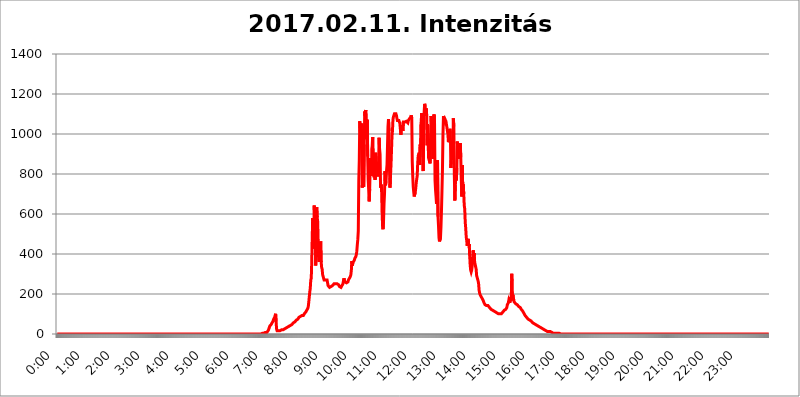
| Category | 2017.02.11. Intenzitás [W/m^2] |
|---|---|
| 0.0 | 0 |
| 0.0006944444444444445 | 0 |
| 0.001388888888888889 | 0 |
| 0.0020833333333333333 | 0 |
| 0.002777777777777778 | 0 |
| 0.003472222222222222 | 0 |
| 0.004166666666666667 | 0 |
| 0.004861111111111111 | 0 |
| 0.005555555555555556 | 0 |
| 0.0062499999999999995 | 0 |
| 0.006944444444444444 | 0 |
| 0.007638888888888889 | 0 |
| 0.008333333333333333 | 0 |
| 0.009027777777777779 | 0 |
| 0.009722222222222222 | 0 |
| 0.010416666666666666 | 0 |
| 0.011111111111111112 | 0 |
| 0.011805555555555555 | 0 |
| 0.012499999999999999 | 0 |
| 0.013194444444444444 | 0 |
| 0.013888888888888888 | 0 |
| 0.014583333333333332 | 0 |
| 0.015277777777777777 | 0 |
| 0.015972222222222224 | 0 |
| 0.016666666666666666 | 0 |
| 0.017361111111111112 | 0 |
| 0.018055555555555557 | 0 |
| 0.01875 | 0 |
| 0.019444444444444445 | 0 |
| 0.02013888888888889 | 0 |
| 0.020833333333333332 | 0 |
| 0.02152777777777778 | 0 |
| 0.022222222222222223 | 0 |
| 0.02291666666666667 | 0 |
| 0.02361111111111111 | 0 |
| 0.024305555555555556 | 0 |
| 0.024999999999999998 | 0 |
| 0.025694444444444447 | 0 |
| 0.02638888888888889 | 0 |
| 0.027083333333333334 | 0 |
| 0.027777777777777776 | 0 |
| 0.02847222222222222 | 0 |
| 0.029166666666666664 | 0 |
| 0.029861111111111113 | 0 |
| 0.030555555555555555 | 0 |
| 0.03125 | 0 |
| 0.03194444444444445 | 0 |
| 0.03263888888888889 | 0 |
| 0.03333333333333333 | 0 |
| 0.034027777777777775 | 0 |
| 0.034722222222222224 | 0 |
| 0.035416666666666666 | 0 |
| 0.036111111111111115 | 0 |
| 0.03680555555555556 | 0 |
| 0.0375 | 0 |
| 0.03819444444444444 | 0 |
| 0.03888888888888889 | 0 |
| 0.03958333333333333 | 0 |
| 0.04027777777777778 | 0 |
| 0.04097222222222222 | 0 |
| 0.041666666666666664 | 0 |
| 0.042361111111111106 | 0 |
| 0.04305555555555556 | 0 |
| 0.043750000000000004 | 0 |
| 0.044444444444444446 | 0 |
| 0.04513888888888889 | 0 |
| 0.04583333333333334 | 0 |
| 0.04652777777777778 | 0 |
| 0.04722222222222222 | 0 |
| 0.04791666666666666 | 0 |
| 0.04861111111111111 | 0 |
| 0.049305555555555554 | 0 |
| 0.049999999999999996 | 0 |
| 0.05069444444444445 | 0 |
| 0.051388888888888894 | 0 |
| 0.052083333333333336 | 0 |
| 0.05277777777777778 | 0 |
| 0.05347222222222222 | 0 |
| 0.05416666666666667 | 0 |
| 0.05486111111111111 | 0 |
| 0.05555555555555555 | 0 |
| 0.05625 | 0 |
| 0.05694444444444444 | 0 |
| 0.057638888888888885 | 0 |
| 0.05833333333333333 | 0 |
| 0.05902777777777778 | 0 |
| 0.059722222222222225 | 0 |
| 0.06041666666666667 | 0 |
| 0.061111111111111116 | 0 |
| 0.06180555555555556 | 0 |
| 0.0625 | 0 |
| 0.06319444444444444 | 0 |
| 0.06388888888888888 | 0 |
| 0.06458333333333334 | 0 |
| 0.06527777777777778 | 0 |
| 0.06597222222222222 | 0 |
| 0.06666666666666667 | 0 |
| 0.06736111111111111 | 0 |
| 0.06805555555555555 | 0 |
| 0.06874999999999999 | 0 |
| 0.06944444444444443 | 0 |
| 0.07013888888888889 | 0 |
| 0.07083333333333333 | 0 |
| 0.07152777777777779 | 0 |
| 0.07222222222222223 | 0 |
| 0.07291666666666667 | 0 |
| 0.07361111111111111 | 0 |
| 0.07430555555555556 | 0 |
| 0.075 | 0 |
| 0.07569444444444444 | 0 |
| 0.0763888888888889 | 0 |
| 0.07708333333333334 | 0 |
| 0.07777777777777778 | 0 |
| 0.07847222222222222 | 0 |
| 0.07916666666666666 | 0 |
| 0.0798611111111111 | 0 |
| 0.08055555555555556 | 0 |
| 0.08125 | 0 |
| 0.08194444444444444 | 0 |
| 0.08263888888888889 | 0 |
| 0.08333333333333333 | 0 |
| 0.08402777777777777 | 0 |
| 0.08472222222222221 | 0 |
| 0.08541666666666665 | 0 |
| 0.08611111111111112 | 0 |
| 0.08680555555555557 | 0 |
| 0.08750000000000001 | 0 |
| 0.08819444444444445 | 0 |
| 0.08888888888888889 | 0 |
| 0.08958333333333333 | 0 |
| 0.09027777777777778 | 0 |
| 0.09097222222222222 | 0 |
| 0.09166666666666667 | 0 |
| 0.09236111111111112 | 0 |
| 0.09305555555555556 | 0 |
| 0.09375 | 0 |
| 0.09444444444444444 | 0 |
| 0.09513888888888888 | 0 |
| 0.09583333333333333 | 0 |
| 0.09652777777777777 | 0 |
| 0.09722222222222222 | 0 |
| 0.09791666666666667 | 0 |
| 0.09861111111111111 | 0 |
| 0.09930555555555555 | 0 |
| 0.09999999999999999 | 0 |
| 0.10069444444444443 | 0 |
| 0.1013888888888889 | 0 |
| 0.10208333333333335 | 0 |
| 0.10277777777777779 | 0 |
| 0.10347222222222223 | 0 |
| 0.10416666666666667 | 0 |
| 0.10486111111111111 | 0 |
| 0.10555555555555556 | 0 |
| 0.10625 | 0 |
| 0.10694444444444444 | 0 |
| 0.1076388888888889 | 0 |
| 0.10833333333333334 | 0 |
| 0.10902777777777778 | 0 |
| 0.10972222222222222 | 0 |
| 0.1111111111111111 | 0 |
| 0.11180555555555556 | 0 |
| 0.11180555555555556 | 0 |
| 0.1125 | 0 |
| 0.11319444444444444 | 0 |
| 0.11388888888888889 | 0 |
| 0.11458333333333333 | 0 |
| 0.11527777777777777 | 0 |
| 0.11597222222222221 | 0 |
| 0.11666666666666665 | 0 |
| 0.1173611111111111 | 0 |
| 0.11805555555555557 | 0 |
| 0.11944444444444445 | 0 |
| 0.12013888888888889 | 0 |
| 0.12083333333333333 | 0 |
| 0.12152777777777778 | 0 |
| 0.12222222222222223 | 0 |
| 0.12291666666666667 | 0 |
| 0.12291666666666667 | 0 |
| 0.12361111111111112 | 0 |
| 0.12430555555555556 | 0 |
| 0.125 | 0 |
| 0.12569444444444444 | 0 |
| 0.12638888888888888 | 0 |
| 0.12708333333333333 | 0 |
| 0.16875 | 0 |
| 0.12847222222222224 | 0 |
| 0.12916666666666668 | 0 |
| 0.12986111111111112 | 0 |
| 0.13055555555555556 | 0 |
| 0.13125 | 0 |
| 0.13194444444444445 | 0 |
| 0.1326388888888889 | 0 |
| 0.13333333333333333 | 0 |
| 0.13402777777777777 | 0 |
| 0.13402777777777777 | 0 |
| 0.13472222222222222 | 0 |
| 0.13541666666666666 | 0 |
| 0.1361111111111111 | 0 |
| 0.13749999999999998 | 0 |
| 0.13819444444444443 | 0 |
| 0.1388888888888889 | 0 |
| 0.13958333333333334 | 0 |
| 0.14027777777777778 | 0 |
| 0.14097222222222222 | 0 |
| 0.14166666666666666 | 0 |
| 0.1423611111111111 | 0 |
| 0.14305555555555557 | 0 |
| 0.14375000000000002 | 0 |
| 0.14444444444444446 | 0 |
| 0.1451388888888889 | 0 |
| 0.1451388888888889 | 0 |
| 0.14652777777777778 | 0 |
| 0.14722222222222223 | 0 |
| 0.14791666666666667 | 0 |
| 0.1486111111111111 | 0 |
| 0.14930555555555555 | 0 |
| 0.15 | 0 |
| 0.15069444444444444 | 0 |
| 0.15138888888888888 | 0 |
| 0.15208333333333332 | 0 |
| 0.15277777777777776 | 0 |
| 0.15347222222222223 | 0 |
| 0.15416666666666667 | 0 |
| 0.15486111111111112 | 0 |
| 0.15555555555555556 | 0 |
| 0.15625 | 0 |
| 0.15694444444444444 | 0 |
| 0.15763888888888888 | 0 |
| 0.15833333333333333 | 0 |
| 0.15902777777777777 | 0 |
| 0.15972222222222224 | 0 |
| 0.16041666666666668 | 0 |
| 0.16111111111111112 | 0 |
| 0.16180555555555556 | 0 |
| 0.1625 | 0 |
| 0.16319444444444445 | 0 |
| 0.1638888888888889 | 0 |
| 0.16458333333333333 | 0 |
| 0.16527777777777777 | 0 |
| 0.16597222222222222 | 0 |
| 0.16666666666666666 | 0 |
| 0.1673611111111111 | 0 |
| 0.16805555555555554 | 0 |
| 0.16874999999999998 | 0 |
| 0.16944444444444443 | 0 |
| 0.17013888888888887 | 0 |
| 0.1708333333333333 | 0 |
| 0.17152777777777775 | 0 |
| 0.17222222222222225 | 0 |
| 0.1729166666666667 | 0 |
| 0.17361111111111113 | 0 |
| 0.17430555555555557 | 0 |
| 0.17500000000000002 | 0 |
| 0.17569444444444446 | 0 |
| 0.1763888888888889 | 0 |
| 0.17708333333333334 | 0 |
| 0.17777777777777778 | 0 |
| 0.17847222222222223 | 0 |
| 0.17916666666666667 | 0 |
| 0.1798611111111111 | 0 |
| 0.18055555555555555 | 0 |
| 0.18125 | 0 |
| 0.18194444444444444 | 0 |
| 0.1826388888888889 | 0 |
| 0.18333333333333335 | 0 |
| 0.1840277777777778 | 0 |
| 0.18472222222222223 | 0 |
| 0.18541666666666667 | 0 |
| 0.18611111111111112 | 0 |
| 0.18680555555555556 | 0 |
| 0.1875 | 0 |
| 0.18819444444444444 | 0 |
| 0.18888888888888888 | 0 |
| 0.18958333333333333 | 0 |
| 0.19027777777777777 | 0 |
| 0.1909722222222222 | 0 |
| 0.19166666666666665 | 0 |
| 0.19236111111111112 | 0 |
| 0.19305555555555554 | 0 |
| 0.19375 | 0 |
| 0.19444444444444445 | 0 |
| 0.1951388888888889 | 0 |
| 0.19583333333333333 | 0 |
| 0.19652777777777777 | 0 |
| 0.19722222222222222 | 0 |
| 0.19791666666666666 | 0 |
| 0.1986111111111111 | 0 |
| 0.19930555555555554 | 0 |
| 0.19999999999999998 | 0 |
| 0.20069444444444443 | 0 |
| 0.20138888888888887 | 0 |
| 0.2020833333333333 | 0 |
| 0.2027777777777778 | 0 |
| 0.2034722222222222 | 0 |
| 0.2041666666666667 | 0 |
| 0.20486111111111113 | 0 |
| 0.20555555555555557 | 0 |
| 0.20625000000000002 | 0 |
| 0.20694444444444446 | 0 |
| 0.2076388888888889 | 0 |
| 0.20833333333333334 | 0 |
| 0.20902777777777778 | 0 |
| 0.20972222222222223 | 0 |
| 0.21041666666666667 | 0 |
| 0.2111111111111111 | 0 |
| 0.21180555555555555 | 0 |
| 0.2125 | 0 |
| 0.21319444444444444 | 0 |
| 0.2138888888888889 | 0 |
| 0.21458333333333335 | 0 |
| 0.2152777777777778 | 0 |
| 0.21597222222222223 | 0 |
| 0.21666666666666667 | 0 |
| 0.21736111111111112 | 0 |
| 0.21805555555555556 | 0 |
| 0.21875 | 0 |
| 0.21944444444444444 | 0 |
| 0.22013888888888888 | 0 |
| 0.22083333333333333 | 0 |
| 0.22152777777777777 | 0 |
| 0.2222222222222222 | 0 |
| 0.22291666666666665 | 0 |
| 0.2236111111111111 | 0 |
| 0.22430555555555556 | 0 |
| 0.225 | 0 |
| 0.22569444444444445 | 0 |
| 0.2263888888888889 | 0 |
| 0.22708333333333333 | 0 |
| 0.22777777777777777 | 0 |
| 0.22847222222222222 | 0 |
| 0.22916666666666666 | 0 |
| 0.2298611111111111 | 0 |
| 0.23055555555555554 | 0 |
| 0.23124999999999998 | 0 |
| 0.23194444444444443 | 0 |
| 0.23263888888888887 | 0 |
| 0.2333333333333333 | 0 |
| 0.2340277777777778 | 0 |
| 0.2347222222222222 | 0 |
| 0.2354166666666667 | 0 |
| 0.23611111111111113 | 0 |
| 0.23680555555555557 | 0 |
| 0.23750000000000002 | 0 |
| 0.23819444444444446 | 0 |
| 0.2388888888888889 | 0 |
| 0.23958333333333334 | 0 |
| 0.24027777777777778 | 0 |
| 0.24097222222222223 | 0 |
| 0.24166666666666667 | 0 |
| 0.2423611111111111 | 0 |
| 0.24305555555555555 | 0 |
| 0.24375 | 0 |
| 0.24444444444444446 | 0 |
| 0.24513888888888888 | 0 |
| 0.24583333333333335 | 0 |
| 0.2465277777777778 | 0 |
| 0.24722222222222223 | 0 |
| 0.24791666666666667 | 0 |
| 0.24861111111111112 | 0 |
| 0.24930555555555556 | 0 |
| 0.25 | 0 |
| 0.25069444444444444 | 0 |
| 0.2513888888888889 | 0 |
| 0.2520833333333333 | 0 |
| 0.25277777777777777 | 0 |
| 0.2534722222222222 | 0 |
| 0.25416666666666665 | 0 |
| 0.2548611111111111 | 0 |
| 0.2555555555555556 | 0 |
| 0.25625000000000003 | 0 |
| 0.2569444444444445 | 0 |
| 0.2576388888888889 | 0 |
| 0.25833333333333336 | 0 |
| 0.2590277777777778 | 0 |
| 0.25972222222222224 | 0 |
| 0.2604166666666667 | 0 |
| 0.2611111111111111 | 0 |
| 0.26180555555555557 | 0 |
| 0.2625 | 0 |
| 0.26319444444444445 | 0 |
| 0.2638888888888889 | 0 |
| 0.26458333333333334 | 0 |
| 0.2652777777777778 | 0 |
| 0.2659722222222222 | 0 |
| 0.26666666666666666 | 0 |
| 0.2673611111111111 | 0 |
| 0.26805555555555555 | 0 |
| 0.26875 | 0 |
| 0.26944444444444443 | 0 |
| 0.2701388888888889 | 0 |
| 0.2708333333333333 | 0 |
| 0.27152777777777776 | 0 |
| 0.2722222222222222 | 0 |
| 0.27291666666666664 | 0 |
| 0.2736111111111111 | 0 |
| 0.2743055555555555 | 0 |
| 0.27499999999999997 | 0 |
| 0.27569444444444446 | 0 |
| 0.27638888888888885 | 0 |
| 0.27708333333333335 | 0 |
| 0.2777777777777778 | 0 |
| 0.27847222222222223 | 0 |
| 0.2791666666666667 | 0 |
| 0.2798611111111111 | 0 |
| 0.28055555555555556 | 0 |
| 0.28125 | 0 |
| 0.28194444444444444 | 0 |
| 0.2826388888888889 | 0 |
| 0.2833333333333333 | 0 |
| 0.28402777777777777 | 0 |
| 0.2847222222222222 | 0 |
| 0.28541666666666665 | 0 |
| 0.28611111111111115 | 3.525 |
| 0.28680555555555554 | 3.525 |
| 0.28750000000000003 | 3.525 |
| 0.2881944444444445 | 3.525 |
| 0.2888888888888889 | 3.525 |
| 0.28958333333333336 | 3.525 |
| 0.2902777777777778 | 3.525 |
| 0.29097222222222224 | 3.525 |
| 0.2916666666666667 | 7.887 |
| 0.2923611111111111 | 7.887 |
| 0.29305555555555557 | 7.887 |
| 0.29375 | 7.887 |
| 0.29444444444444445 | 12.257 |
| 0.2951388888888889 | 12.257 |
| 0.29583333333333334 | 16.636 |
| 0.2965277777777778 | 21.024 |
| 0.2972222222222222 | 29.823 |
| 0.29791666666666666 | 38.653 |
| 0.2986111111111111 | 38.653 |
| 0.29930555555555555 | 43.079 |
| 0.3 | 47.511 |
| 0.30069444444444443 | 51.951 |
| 0.3013888888888889 | 56.398 |
| 0.3020833333333333 | 60.85 |
| 0.30277777777777776 | 65.31 |
| 0.3034722222222222 | 74.246 |
| 0.30416666666666664 | 78.722 |
| 0.3048611111111111 | 83.205 |
| 0.3055555555555555 | 92.184 |
| 0.30624999999999997 | 101.184 |
| 0.3069444444444444 | 60.85 |
| 0.3076388888888889 | 25.419 |
| 0.30833333333333335 | 16.636 |
| 0.3090277777777778 | 16.636 |
| 0.30972222222222223 | 16.636 |
| 0.3104166666666667 | 16.636 |
| 0.3111111111111111 | 16.636 |
| 0.31180555555555556 | 16.636 |
| 0.3125 | 16.636 |
| 0.31319444444444444 | 21.024 |
| 0.3138888888888889 | 21.024 |
| 0.3145833333333333 | 21.024 |
| 0.31527777777777777 | 21.024 |
| 0.3159722222222222 | 21.024 |
| 0.31666666666666665 | 21.024 |
| 0.31736111111111115 | 25.419 |
| 0.31805555555555554 | 25.419 |
| 0.31875000000000003 | 25.419 |
| 0.3194444444444445 | 29.823 |
| 0.3201388888888889 | 29.823 |
| 0.32083333333333336 | 29.823 |
| 0.3215277777777778 | 34.234 |
| 0.32222222222222224 | 34.234 |
| 0.3229166666666667 | 34.234 |
| 0.3236111111111111 | 34.234 |
| 0.32430555555555557 | 38.653 |
| 0.325 | 38.653 |
| 0.32569444444444445 | 38.653 |
| 0.3263888888888889 | 38.653 |
| 0.32708333333333334 | 43.079 |
| 0.3277777777777778 | 43.079 |
| 0.3284722222222222 | 47.511 |
| 0.32916666666666666 | 47.511 |
| 0.3298611111111111 | 47.511 |
| 0.33055555555555555 | 51.951 |
| 0.33125 | 56.398 |
| 0.33194444444444443 | 56.398 |
| 0.3326388888888889 | 60.85 |
| 0.3333333333333333 | 60.85 |
| 0.3340277777777778 | 65.31 |
| 0.3347222222222222 | 65.31 |
| 0.3354166666666667 | 69.775 |
| 0.3361111111111111 | 69.775 |
| 0.3368055555555556 | 74.246 |
| 0.33749999999999997 | 74.246 |
| 0.33819444444444446 | 78.722 |
| 0.33888888888888885 | 83.205 |
| 0.33958333333333335 | 83.205 |
| 0.34027777777777773 | 87.692 |
| 0.34097222222222223 | 87.692 |
| 0.3416666666666666 | 92.184 |
| 0.3423611111111111 | 92.184 |
| 0.3430555555555555 | 92.184 |
| 0.34375 | 92.184 |
| 0.3444444444444445 | 92.184 |
| 0.3451388888888889 | 92.184 |
| 0.3458333333333334 | 96.682 |
| 0.34652777777777777 | 101.184 |
| 0.34722222222222227 | 105.69 |
| 0.34791666666666665 | 105.69 |
| 0.34861111111111115 | 110.201 |
| 0.34930555555555554 | 114.716 |
| 0.35000000000000003 | 119.235 |
| 0.3506944444444444 | 123.758 |
| 0.3513888888888889 | 128.284 |
| 0.3520833333333333 | 137.347 |
| 0.3527777777777778 | 160.056 |
| 0.3534722222222222 | 164.605 |
| 0.3541666666666667 | 210.182 |
| 0.3548611111111111 | 228.436 |
| 0.35555555555555557 | 269.49 |
| 0.35625 | 278.603 |
| 0.35694444444444445 | 360.221 |
| 0.3576388888888889 | 489.108 |
| 0.35833333333333334 | 579.542 |
| 0.3590277777777778 | 427.39 |
| 0.3597222222222222 | 453.968 |
| 0.36041666666666666 | 642.4 |
| 0.3611111111111111 | 571.049 |
| 0.36180555555555555 | 545.416 |
| 0.3625 | 342.162 |
| 0.36319444444444443 | 519.555 |
| 0.3638888888888889 | 634.105 |
| 0.3645833333333333 | 583.779 |
| 0.3652777777777778 | 562.53 |
| 0.3659722222222222 | 462.786 |
| 0.3666666666666667 | 373.729 |
| 0.3673611111111111 | 360.221 |
| 0.3680555555555556 | 431.833 |
| 0.36874999999999997 | 418.492 |
| 0.36944444444444446 | 462.786 |
| 0.37013888888888885 | 360.221 |
| 0.37083333333333335 | 333.113 |
| 0.37152777777777773 | 324.052 |
| 0.37222222222222223 | 296.808 |
| 0.3729166666666666 | 287.709 |
| 0.3736111111111111 | 278.603 |
| 0.3743055555555555 | 269.49 |
| 0.375 | 269.49 |
| 0.3756944444444445 | 269.49 |
| 0.3763888888888889 | 269.49 |
| 0.3770833333333334 | 274.047 |
| 0.37777777777777777 | 274.047 |
| 0.37847222222222227 | 269.49 |
| 0.37916666666666665 | 255.813 |
| 0.37986111111111115 | 242.127 |
| 0.38055555555555554 | 237.564 |
| 0.38125000000000003 | 237.564 |
| 0.3819444444444444 | 233 |
| 0.3826388888888889 | 233 |
| 0.3833333333333333 | 233 |
| 0.3840277777777778 | 237.564 |
| 0.3847222222222222 | 237.564 |
| 0.3854166666666667 | 242.127 |
| 0.3861111111111111 | 242.127 |
| 0.38680555555555557 | 246.689 |
| 0.3875 | 246.689 |
| 0.38819444444444445 | 251.251 |
| 0.3888888888888889 | 251.251 |
| 0.38958333333333334 | 251.251 |
| 0.3902777777777778 | 251.251 |
| 0.3909722222222222 | 251.251 |
| 0.39166666666666666 | 251.251 |
| 0.3923611111111111 | 251.251 |
| 0.39305555555555555 | 251.251 |
| 0.39375 | 246.689 |
| 0.39444444444444443 | 246.689 |
| 0.3951388888888889 | 242.127 |
| 0.3958333333333333 | 237.564 |
| 0.3965277777777778 | 233 |
| 0.3972222222222222 | 233 |
| 0.3979166666666667 | 233 |
| 0.3986111111111111 | 237.564 |
| 0.3993055555555556 | 242.127 |
| 0.39999999999999997 | 246.689 |
| 0.40069444444444446 | 251.251 |
| 0.40138888888888885 | 255.813 |
| 0.40208333333333335 | 278.603 |
| 0.40277777777777773 | 269.49 |
| 0.40347222222222223 | 260.373 |
| 0.4041666666666666 | 255.813 |
| 0.4048611111111111 | 255.813 |
| 0.4055555555555555 | 255.813 |
| 0.40625 | 255.813 |
| 0.4069444444444445 | 260.373 |
| 0.4076388888888889 | 260.373 |
| 0.4083333333333334 | 269.49 |
| 0.40902777777777777 | 274.047 |
| 0.40972222222222227 | 278.603 |
| 0.41041666666666665 | 283.156 |
| 0.41111111111111115 | 287.709 |
| 0.41180555555555554 | 296.808 |
| 0.41250000000000003 | 319.517 |
| 0.4131944444444444 | 364.728 |
| 0.4138888888888889 | 342.162 |
| 0.4145833333333333 | 355.712 |
| 0.4152777777777778 | 351.198 |
| 0.4159722222222222 | 360.221 |
| 0.4166666666666667 | 369.23 |
| 0.4173611111111111 | 378.224 |
| 0.41805555555555557 | 382.715 |
| 0.41875 | 387.202 |
| 0.41944444444444445 | 396.164 |
| 0.4201388888888889 | 414.035 |
| 0.42083333333333334 | 445.129 |
| 0.4215277777777778 | 471.582 |
| 0.4222222222222222 | 515.223 |
| 0.42291666666666666 | 767.62 |
| 0.4236111111111111 | 868.305 |
| 0.42430555555555555 | 1063.51 |
| 0.425 | 1014.852 |
| 0.42569444444444443 | 996.182 |
| 0.4263888888888889 | 1052.255 |
| 0.4270833333333333 | 928.819 |
| 0.4277777777777778 | 731.896 |
| 0.4284722222222222 | 779.42 |
| 0.4291666666666667 | 747.834 |
| 0.4298611111111111 | 735.89 |
| 0.4305555555555556 | 947.58 |
| 0.43124999999999997 | 1112.618 |
| 0.43194444444444446 | 1089.873 |
| 0.43263888888888885 | 1120.238 |
| 0.43333333333333335 | 1063.51 |
| 0.43402777777777773 | 973.772 |
| 0.43472222222222223 | 1071.027 |
| 0.4354166666666666 | 887.309 |
| 0.4361111111111111 | 771.559 |
| 0.4368055555555555 | 719.877 |
| 0.4375 | 663.019 |
| 0.4381944444444445 | 723.889 |
| 0.4388888888888889 | 837.682 |
| 0.4395833333333334 | 879.719 |
| 0.44027777777777777 | 806.757 |
| 0.44097222222222227 | 791.169 |
| 0.44166666666666665 | 936.33 |
| 0.44236111111111115 | 984.98 |
| 0.44305555555555554 | 860.676 |
| 0.44375000000000003 | 833.834 |
| 0.4444444444444444 | 783.342 |
| 0.4451388888888889 | 902.447 |
| 0.4458333333333333 | 771.559 |
| 0.4465277777777778 | 906.223 |
| 0.4472222222222222 | 872.114 |
| 0.4479166666666667 | 853.029 |
| 0.4486111111111111 | 833.834 |
| 0.44930555555555557 | 818.392 |
| 0.45 | 787.258 |
| 0.45069444444444445 | 837.682 |
| 0.4513888888888889 | 981.244 |
| 0.45208333333333334 | 925.06 |
| 0.4527777777777778 | 898.668 |
| 0.4534722222222222 | 731.896 |
| 0.45416666666666666 | 747.834 |
| 0.4548611111111111 | 723.889 |
| 0.45555555555555555 | 617.436 |
| 0.45625 | 541.121 |
| 0.45694444444444443 | 523.88 |
| 0.4576388888888889 | 566.793 |
| 0.4583333333333333 | 650.667 |
| 0.4590277777777778 | 703.762 |
| 0.4597222222222222 | 814.519 |
| 0.4604166666666667 | 743.859 |
| 0.4611111111111111 | 763.674 |
| 0.4618055555555556 | 814.519 |
| 0.46249999999999997 | 845.365 |
| 0.46319444444444446 | 940.082 |
| 0.46388888888888885 | 1037.277 |
| 0.46458333333333335 | 1074.789 |
| 0.46527777777777773 | 1014.852 |
| 0.46597222222222223 | 822.26 |
| 0.4666666666666666 | 731.896 |
| 0.4673611111111111 | 791.169 |
| 0.4680555555555555 | 841.526 |
| 0.46875 | 845.365 |
| 0.4694444444444445 | 984.98 |
| 0.4701388888888889 | 1014.852 |
| 0.4708333333333334 | 1071.027 |
| 0.47152777777777777 | 1086.097 |
| 0.47222222222222227 | 1086.097 |
| 0.47291666666666665 | 1101.226 |
| 0.47361111111111115 | 1097.437 |
| 0.47430555555555554 | 1101.226 |
| 0.47500000000000003 | 1101.226 |
| 0.4756944444444444 | 1093.653 |
| 0.4763888888888889 | 1078.555 |
| 0.4770833333333333 | 1067.267 |
| 0.4777777777777778 | 1063.51 |
| 0.4784722222222222 | 1063.51 |
| 0.4791666666666667 | 1067.267 |
| 0.4798611111111111 | 1063.51 |
| 0.48055555555555557 | 1052.255 |
| 0.48125 | 1052.255 |
| 0.48194444444444445 | 996.182 |
| 0.4826388888888889 | 1044.762 |
| 0.48333333333333334 | 1044.762 |
| 0.4840277777777778 | 1048.508 |
| 0.4847222222222222 | 1014.852 |
| 0.48541666666666666 | 1059.756 |
| 0.4861111111111111 | 1059.756 |
| 0.48680555555555555 | 1059.756 |
| 0.4875 | 1059.756 |
| 0.48819444444444443 | 1063.51 |
| 0.4888888888888889 | 1063.51 |
| 0.4895833333333333 | 1063.51 |
| 0.4902777777777778 | 1063.51 |
| 0.4909722222222222 | 1063.51 |
| 0.4916666666666667 | 1056.004 |
| 0.4923611111111111 | 1067.267 |
| 0.4930555555555556 | 1071.027 |
| 0.49374999999999997 | 1074.789 |
| 0.49444444444444446 | 1078.555 |
| 0.49513888888888885 | 1078.555 |
| 0.49583333333333335 | 1086.097 |
| 0.49652777777777773 | 1093.653 |
| 0.49722222222222223 | 1078.555 |
| 0.4979166666666666 | 860.676 |
| 0.4986111111111111 | 787.258 |
| 0.4993055555555555 | 735.89 |
| 0.5 | 707.8 |
| 0.5006944444444444 | 687.544 |
| 0.5013888888888889 | 691.608 |
| 0.5020833333333333 | 707.8 |
| 0.5027777777777778 | 727.896 |
| 0.5034722222222222 | 755.766 |
| 0.5041666666666667 | 759.723 |
| 0.5048611111111111 | 791.169 |
| 0.5055555555555555 | 853.029 |
| 0.50625 | 891.099 |
| 0.5069444444444444 | 894.885 |
| 0.5076388888888889 | 906.223 |
| 0.5083333333333333 | 845.365 |
| 0.5090277777777777 | 947.58 |
| 0.5097222222222222 | 925.06 |
| 0.5104166666666666 | 1059.756 |
| 0.5111111111111112 | 1105.019 |
| 0.5118055555555555 | 1033.537 |
| 0.5125000000000001 | 906.223 |
| 0.5131944444444444 | 814.519 |
| 0.513888888888889 | 977.508 |
| 0.5145833333333333 | 1108.816 |
| 0.5152777777777778 | 1150.946 |
| 0.5159722222222222 | 1139.384 |
| 0.5166666666666667 | 1089.873 |
| 0.517361111111111 | 1127.879 |
| 0.5180555555555556 | 1105.019 |
| 0.5187499999999999 | 943.832 |
| 0.5194444444444445 | 1048.508 |
| 0.5201388888888888 | 962.555 |
| 0.5208333333333334 | 879.719 |
| 0.5215277777777778 | 879.719 |
| 0.5222222222222223 | 883.516 |
| 0.5229166666666667 | 853.029 |
| 0.5236111111111111 | 977.508 |
| 0.5243055555555556 | 1089.873 |
| 0.525 | 1044.762 |
| 0.5256944444444445 | 1007.383 |
| 0.5263888888888889 | 984.98 |
| 0.5270833333333333 | 875.918 |
| 0.5277777777777778 | 875.918 |
| 0.5284722222222222 | 1097.437 |
| 0.5291666666666667 | 1052.255 |
| 0.5298611111111111 | 767.62 |
| 0.5305555555555556 | 719.877 |
| 0.53125 | 687.544 |
| 0.5319444444444444 | 650.667 |
| 0.5326388888888889 | 703.762 |
| 0.5333333333333333 | 868.305 |
| 0.5340277777777778 | 588.009 |
| 0.5347222222222222 | 541.121 |
| 0.5354166666666667 | 480.356 |
| 0.5361111111111111 | 462.786 |
| 0.5368055555555555 | 462.786 |
| 0.5375 | 480.356 |
| 0.5381944444444444 | 536.82 |
| 0.5388888888888889 | 617.436 |
| 0.5395833333333333 | 715.858 |
| 0.5402777777777777 | 822.26 |
| 0.5409722222222222 | 992.448 |
| 0.5416666666666666 | 1089.873 |
| 0.5423611111111112 | 1078.555 |
| 0.5430555555555555 | 1067.267 |
| 0.5437500000000001 | 1074.789 |
| 0.5444444444444444 | 1074.789 |
| 0.545138888888889 | 1063.51 |
| 0.5458333333333333 | 1059.756 |
| 0.5465277777777778 | 1033.537 |
| 0.5472222222222222 | 1014.852 |
| 0.5479166666666667 | 999.916 |
| 0.548611111111111 | 958.814 |
| 0.5493055555555556 | 970.034 |
| 0.5499999999999999 | 1007.383 |
| 0.5506944444444445 | 1026.06 |
| 0.5513888888888888 | 1003.65 |
| 0.5520833333333334 | 829.981 |
| 0.5527777777777778 | 868.305 |
| 0.5534722222222223 | 947.58 |
| 0.5541666666666667 | 925.06 |
| 0.5548611111111111 | 947.58 |
| 0.5555555555555556 | 1078.555 |
| 0.55625 | 1037.277 |
| 0.5569444444444445 | 791.169 |
| 0.5576388888888889 | 667.123 |
| 0.5583333333333333 | 747.834 |
| 0.5590277777777778 | 779.42 |
| 0.5597222222222222 | 767.62 |
| 0.5604166666666667 | 829.981 |
| 0.5611111111111111 | 962.555 |
| 0.5618055555555556 | 875.918 |
| 0.5625 | 955.071 |
| 0.5631944444444444 | 875.918 |
| 0.5638888888888889 | 872.114 |
| 0.5645833333333333 | 925.06 |
| 0.5652777777777778 | 955.071 |
| 0.5659722222222222 | 883.516 |
| 0.5666666666666667 | 771.559 |
| 0.5673611111111111 | 687.544 |
| 0.5680555555555555 | 845.365 |
| 0.56875 | 727.896 |
| 0.5694444444444444 | 747.834 |
| 0.5701388888888889 | 699.717 |
| 0.5708333333333333 | 642.4 |
| 0.5715277777777777 | 625.784 |
| 0.5722222222222222 | 558.261 |
| 0.5729166666666666 | 528.2 |
| 0.5736111111111112 | 484.735 |
| 0.5743055555555555 | 467.187 |
| 0.5750000000000001 | 440.702 |
| 0.5756944444444444 | 462.786 |
| 0.576388888888889 | 475.972 |
| 0.5770833333333333 | 440.702 |
| 0.5777777777777778 | 449.551 |
| 0.5784722222222222 | 391.685 |
| 0.5791666666666667 | 342.162 |
| 0.579861111111111 | 319.517 |
| 0.5805555555555556 | 310.44 |
| 0.5812499999999999 | 319.517 |
| 0.5819444444444445 | 324.052 |
| 0.5826388888888888 | 360.221 |
| 0.5833333333333334 | 418.492 |
| 0.5840277777777778 | 391.685 |
| 0.5847222222222223 | 405.108 |
| 0.5854166666666667 | 360.221 |
| 0.5861111111111111 | 360.221 |
| 0.5868055555555556 | 355.712 |
| 0.5875 | 324.052 |
| 0.5881944444444445 | 292.259 |
| 0.5888888888888889 | 283.156 |
| 0.5895833333333333 | 274.047 |
| 0.5902777777777778 | 264.932 |
| 0.5909722222222222 | 251.251 |
| 0.5916666666666667 | 219.309 |
| 0.5923611111111111 | 205.62 |
| 0.5930555555555556 | 196.497 |
| 0.59375 | 191.937 |
| 0.5944444444444444 | 187.378 |
| 0.5951388888888889 | 182.82 |
| 0.5958333333333333 | 178.264 |
| 0.5965277777777778 | 173.709 |
| 0.5972222222222222 | 169.156 |
| 0.5979166666666667 | 164.605 |
| 0.5986111111111111 | 155.509 |
| 0.5993055555555555 | 150.964 |
| 0.6 | 146.423 |
| 0.6006944444444444 | 141.884 |
| 0.6013888888888889 | 141.884 |
| 0.6020833333333333 | 141.884 |
| 0.6027777777777777 | 141.884 |
| 0.6034722222222222 | 141.884 |
| 0.6041666666666666 | 141.884 |
| 0.6048611111111112 | 137.347 |
| 0.6055555555555555 | 137.347 |
| 0.6062500000000001 | 132.814 |
| 0.6069444444444444 | 128.284 |
| 0.607638888888889 | 128.284 |
| 0.6083333333333333 | 123.758 |
| 0.6090277777777778 | 123.758 |
| 0.6097222222222222 | 119.235 |
| 0.6104166666666667 | 119.235 |
| 0.611111111111111 | 114.716 |
| 0.6118055555555556 | 114.716 |
| 0.6124999999999999 | 114.716 |
| 0.6131944444444445 | 110.201 |
| 0.6138888888888888 | 110.201 |
| 0.6145833333333334 | 110.201 |
| 0.6152777777777778 | 110.201 |
| 0.6159722222222223 | 105.69 |
| 0.6166666666666667 | 105.69 |
| 0.6173611111111111 | 105.69 |
| 0.6180555555555556 | 101.184 |
| 0.61875 | 101.184 |
| 0.6194444444444445 | 101.184 |
| 0.6201388888888889 | 101.184 |
| 0.6208333333333333 | 101.184 |
| 0.6215277777777778 | 101.184 |
| 0.6222222222222222 | 101.184 |
| 0.6229166666666667 | 101.184 |
| 0.6236111111111111 | 105.69 |
| 0.6243055555555556 | 105.69 |
| 0.625 | 110.201 |
| 0.6256944444444444 | 110.201 |
| 0.6263888888888889 | 114.716 |
| 0.6270833333333333 | 119.235 |
| 0.6277777777777778 | 119.235 |
| 0.6284722222222222 | 123.758 |
| 0.6291666666666667 | 123.758 |
| 0.6298611111111111 | 128.284 |
| 0.6305555555555555 | 132.814 |
| 0.63125 | 146.423 |
| 0.6319444444444444 | 150.964 |
| 0.6326388888888889 | 155.509 |
| 0.6333333333333333 | 169.156 |
| 0.6340277777777777 | 164.605 |
| 0.6347222222222222 | 155.509 |
| 0.6354166666666666 | 182.82 |
| 0.6361111111111112 | 164.605 |
| 0.6368055555555555 | 187.378 |
| 0.6375000000000001 | 301.354 |
| 0.6381944444444444 | 173.709 |
| 0.638888888888889 | 196.497 |
| 0.6395833333333333 | 191.937 |
| 0.6402777777777778 | 169.156 |
| 0.6409722222222222 | 160.056 |
| 0.6416666666666667 | 155.509 |
| 0.642361111111111 | 155.509 |
| 0.6430555555555556 | 150.964 |
| 0.6437499999999999 | 146.423 |
| 0.6444444444444445 | 146.423 |
| 0.6451388888888888 | 146.423 |
| 0.6458333333333334 | 141.884 |
| 0.6465277777777778 | 141.884 |
| 0.6472222222222223 | 137.347 |
| 0.6479166666666667 | 137.347 |
| 0.6486111111111111 | 137.347 |
| 0.6493055555555556 | 132.814 |
| 0.65 | 128.284 |
| 0.6506944444444445 | 123.758 |
| 0.6513888888888889 | 123.758 |
| 0.6520833333333333 | 119.235 |
| 0.6527777777777778 | 114.716 |
| 0.6534722222222222 | 110.201 |
| 0.6541666666666667 | 105.69 |
| 0.6548611111111111 | 101.184 |
| 0.6555555555555556 | 101.184 |
| 0.65625 | 92.184 |
| 0.6569444444444444 | 92.184 |
| 0.6576388888888889 | 87.692 |
| 0.6583333333333333 | 83.205 |
| 0.6590277777777778 | 83.205 |
| 0.6597222222222222 | 78.722 |
| 0.6604166666666667 | 74.246 |
| 0.6611111111111111 | 74.246 |
| 0.6618055555555555 | 74.246 |
| 0.6625 | 69.775 |
| 0.6631944444444444 | 65.31 |
| 0.6638888888888889 | 65.31 |
| 0.6645833333333333 | 65.31 |
| 0.6652777777777777 | 60.85 |
| 0.6659722222222222 | 60.85 |
| 0.6666666666666666 | 56.398 |
| 0.6673611111111111 | 56.398 |
| 0.6680555555555556 | 51.951 |
| 0.6687500000000001 | 51.951 |
| 0.6694444444444444 | 47.511 |
| 0.6701388888888888 | 47.511 |
| 0.6708333333333334 | 47.511 |
| 0.6715277777777778 | 43.079 |
| 0.6722222222222222 | 43.079 |
| 0.6729166666666666 | 43.079 |
| 0.6736111111111112 | 38.653 |
| 0.6743055555555556 | 38.653 |
| 0.6749999999999999 | 38.653 |
| 0.6756944444444444 | 38.653 |
| 0.6763888888888889 | 34.234 |
| 0.6770833333333334 | 34.234 |
| 0.6777777777777777 | 29.823 |
| 0.6784722222222223 | 29.823 |
| 0.6791666666666667 | 29.823 |
| 0.6798611111111111 | 25.419 |
| 0.6805555555555555 | 25.419 |
| 0.68125 | 25.419 |
| 0.6819444444444445 | 21.024 |
| 0.6826388888888889 | 21.024 |
| 0.6833333333333332 | 21.024 |
| 0.6840277777777778 | 21.024 |
| 0.6847222222222222 | 16.636 |
| 0.6854166666666667 | 16.636 |
| 0.686111111111111 | 16.636 |
| 0.6868055555555556 | 16.636 |
| 0.6875 | 12.257 |
| 0.6881944444444444 | 12.257 |
| 0.688888888888889 | 12.257 |
| 0.6895833333333333 | 12.257 |
| 0.6902777777777778 | 12.257 |
| 0.6909722222222222 | 12.257 |
| 0.6916666666666668 | 12.257 |
| 0.6923611111111111 | 7.887 |
| 0.6930555555555555 | 12.257 |
| 0.69375 | 7.887 |
| 0.6944444444444445 | 7.887 |
| 0.6951388888888889 | 7.887 |
| 0.6958333333333333 | 3.525 |
| 0.6965277777777777 | 3.525 |
| 0.6972222222222223 | 3.525 |
| 0.6979166666666666 | 3.525 |
| 0.6986111111111111 | 3.525 |
| 0.6993055555555556 | 3.525 |
| 0.7000000000000001 | 3.525 |
| 0.7006944444444444 | 3.525 |
| 0.7013888888888888 | 3.525 |
| 0.7020833333333334 | 3.525 |
| 0.7027777777777778 | 3.525 |
| 0.7034722222222222 | 3.525 |
| 0.7041666666666666 | 3.525 |
| 0.7048611111111112 | 0 |
| 0.7055555555555556 | 0 |
| 0.7062499999999999 | 0 |
| 0.7069444444444444 | 0 |
| 0.7076388888888889 | 0 |
| 0.7083333333333334 | 0 |
| 0.7090277777777777 | 0 |
| 0.7097222222222223 | 0 |
| 0.7104166666666667 | 0 |
| 0.7111111111111111 | 0 |
| 0.7118055555555555 | 0 |
| 0.7125 | 0 |
| 0.7131944444444445 | 0 |
| 0.7138888888888889 | 0 |
| 0.7145833333333332 | 0 |
| 0.7152777777777778 | 0 |
| 0.7159722222222222 | 0 |
| 0.7166666666666667 | 0 |
| 0.717361111111111 | 0 |
| 0.7180555555555556 | 0 |
| 0.71875 | 0 |
| 0.7194444444444444 | 0 |
| 0.720138888888889 | 0 |
| 0.7208333333333333 | 0 |
| 0.7215277777777778 | 0 |
| 0.7222222222222222 | 0 |
| 0.7229166666666668 | 0 |
| 0.7236111111111111 | 0 |
| 0.7243055555555555 | 0 |
| 0.725 | 0 |
| 0.7256944444444445 | 0 |
| 0.7263888888888889 | 0 |
| 0.7270833333333333 | 0 |
| 0.7277777777777777 | 0 |
| 0.7284722222222223 | 0 |
| 0.7291666666666666 | 0 |
| 0.7298611111111111 | 0 |
| 0.7305555555555556 | 0 |
| 0.7312500000000001 | 0 |
| 0.7319444444444444 | 0 |
| 0.7326388888888888 | 0 |
| 0.7333333333333334 | 0 |
| 0.7340277777777778 | 0 |
| 0.7347222222222222 | 0 |
| 0.7354166666666666 | 0 |
| 0.7361111111111112 | 0 |
| 0.7368055555555556 | 0 |
| 0.7374999999999999 | 0 |
| 0.7381944444444444 | 0 |
| 0.7388888888888889 | 0 |
| 0.7395833333333334 | 0 |
| 0.7402777777777777 | 0 |
| 0.7409722222222223 | 0 |
| 0.7416666666666667 | 0 |
| 0.7423611111111111 | 0 |
| 0.7430555555555555 | 0 |
| 0.74375 | 0 |
| 0.7444444444444445 | 0 |
| 0.7451388888888889 | 0 |
| 0.7458333333333332 | 0 |
| 0.7465277777777778 | 0 |
| 0.7472222222222222 | 0 |
| 0.7479166666666667 | 0 |
| 0.748611111111111 | 0 |
| 0.7493055555555556 | 0 |
| 0.75 | 0 |
| 0.7506944444444444 | 0 |
| 0.751388888888889 | 0 |
| 0.7520833333333333 | 0 |
| 0.7527777777777778 | 0 |
| 0.7534722222222222 | 0 |
| 0.7541666666666668 | 0 |
| 0.7548611111111111 | 0 |
| 0.7555555555555555 | 0 |
| 0.75625 | 0 |
| 0.7569444444444445 | 0 |
| 0.7576388888888889 | 0 |
| 0.7583333333333333 | 0 |
| 0.7590277777777777 | 0 |
| 0.7597222222222223 | 0 |
| 0.7604166666666666 | 0 |
| 0.7611111111111111 | 0 |
| 0.7618055555555556 | 0 |
| 0.7625000000000001 | 0 |
| 0.7631944444444444 | 0 |
| 0.7638888888888888 | 0 |
| 0.7645833333333334 | 0 |
| 0.7652777777777778 | 0 |
| 0.7659722222222222 | 0 |
| 0.7666666666666666 | 0 |
| 0.7673611111111112 | 0 |
| 0.7680555555555556 | 0 |
| 0.7687499999999999 | 0 |
| 0.7694444444444444 | 0 |
| 0.7701388888888889 | 0 |
| 0.7708333333333334 | 0 |
| 0.7715277777777777 | 0 |
| 0.7722222222222223 | 0 |
| 0.7729166666666667 | 0 |
| 0.7736111111111111 | 0 |
| 0.7743055555555555 | 0 |
| 0.775 | 0 |
| 0.7756944444444445 | 0 |
| 0.7763888888888889 | 0 |
| 0.7770833333333332 | 0 |
| 0.7777777777777778 | 0 |
| 0.7784722222222222 | 0 |
| 0.7791666666666667 | 0 |
| 0.779861111111111 | 0 |
| 0.7805555555555556 | 0 |
| 0.78125 | 0 |
| 0.7819444444444444 | 0 |
| 0.782638888888889 | 0 |
| 0.7833333333333333 | 0 |
| 0.7840277777777778 | 0 |
| 0.7847222222222222 | 0 |
| 0.7854166666666668 | 0 |
| 0.7861111111111111 | 0 |
| 0.7868055555555555 | 0 |
| 0.7875 | 0 |
| 0.7881944444444445 | 0 |
| 0.7888888888888889 | 0 |
| 0.7895833333333333 | 0 |
| 0.7902777777777777 | 0 |
| 0.7909722222222223 | 0 |
| 0.7916666666666666 | 0 |
| 0.7923611111111111 | 0 |
| 0.7930555555555556 | 0 |
| 0.7937500000000001 | 0 |
| 0.7944444444444444 | 0 |
| 0.7951388888888888 | 0 |
| 0.7958333333333334 | 0 |
| 0.7965277777777778 | 0 |
| 0.7972222222222222 | 0 |
| 0.7979166666666666 | 0 |
| 0.7986111111111112 | 0 |
| 0.7993055555555556 | 0 |
| 0.7999999999999999 | 0 |
| 0.8006944444444444 | 0 |
| 0.8013888888888889 | 0 |
| 0.8020833333333334 | 0 |
| 0.8027777777777777 | 0 |
| 0.8034722222222223 | 0 |
| 0.8041666666666667 | 0 |
| 0.8048611111111111 | 0 |
| 0.8055555555555555 | 0 |
| 0.80625 | 0 |
| 0.8069444444444445 | 0 |
| 0.8076388888888889 | 0 |
| 0.8083333333333332 | 0 |
| 0.8090277777777778 | 0 |
| 0.8097222222222222 | 0 |
| 0.8104166666666667 | 0 |
| 0.811111111111111 | 0 |
| 0.8118055555555556 | 0 |
| 0.8125 | 0 |
| 0.8131944444444444 | 0 |
| 0.813888888888889 | 0 |
| 0.8145833333333333 | 0 |
| 0.8152777777777778 | 0 |
| 0.8159722222222222 | 0 |
| 0.8166666666666668 | 0 |
| 0.8173611111111111 | 0 |
| 0.8180555555555555 | 0 |
| 0.81875 | 0 |
| 0.8194444444444445 | 0 |
| 0.8201388888888889 | 0 |
| 0.8208333333333333 | 0 |
| 0.8215277777777777 | 0 |
| 0.8222222222222223 | 0 |
| 0.8229166666666666 | 0 |
| 0.8236111111111111 | 0 |
| 0.8243055555555556 | 0 |
| 0.8250000000000001 | 0 |
| 0.8256944444444444 | 0 |
| 0.8263888888888888 | 0 |
| 0.8270833333333334 | 0 |
| 0.8277777777777778 | 0 |
| 0.8284722222222222 | 0 |
| 0.8291666666666666 | 0 |
| 0.8298611111111112 | 0 |
| 0.8305555555555556 | 0 |
| 0.8312499999999999 | 0 |
| 0.8319444444444444 | 0 |
| 0.8326388888888889 | 0 |
| 0.8333333333333334 | 0 |
| 0.8340277777777777 | 0 |
| 0.8347222222222223 | 0 |
| 0.8354166666666667 | 0 |
| 0.8361111111111111 | 0 |
| 0.8368055555555555 | 0 |
| 0.8375 | 0 |
| 0.8381944444444445 | 0 |
| 0.8388888888888889 | 0 |
| 0.8395833333333332 | 0 |
| 0.8402777777777778 | 0 |
| 0.8409722222222222 | 0 |
| 0.8416666666666667 | 0 |
| 0.842361111111111 | 0 |
| 0.8430555555555556 | 0 |
| 0.84375 | 0 |
| 0.8444444444444444 | 0 |
| 0.845138888888889 | 0 |
| 0.8458333333333333 | 0 |
| 0.8465277777777778 | 0 |
| 0.8472222222222222 | 0 |
| 0.8479166666666668 | 0 |
| 0.8486111111111111 | 0 |
| 0.8493055555555555 | 0 |
| 0.85 | 0 |
| 0.8506944444444445 | 0 |
| 0.8513888888888889 | 0 |
| 0.8520833333333333 | 0 |
| 0.8527777777777777 | 0 |
| 0.8534722222222223 | 0 |
| 0.8541666666666666 | 0 |
| 0.8548611111111111 | 0 |
| 0.8555555555555556 | 0 |
| 0.8562500000000001 | 0 |
| 0.8569444444444444 | 0 |
| 0.8576388888888888 | 0 |
| 0.8583333333333334 | 0 |
| 0.8590277777777778 | 0 |
| 0.8597222222222222 | 0 |
| 0.8604166666666666 | 0 |
| 0.8611111111111112 | 0 |
| 0.8618055555555556 | 0 |
| 0.8624999999999999 | 0 |
| 0.8631944444444444 | 0 |
| 0.8638888888888889 | 0 |
| 0.8645833333333334 | 0 |
| 0.8652777777777777 | 0 |
| 0.8659722222222223 | 0 |
| 0.8666666666666667 | 0 |
| 0.8673611111111111 | 0 |
| 0.8680555555555555 | 0 |
| 0.86875 | 0 |
| 0.8694444444444445 | 0 |
| 0.8701388888888889 | 0 |
| 0.8708333333333332 | 0 |
| 0.8715277777777778 | 0 |
| 0.8722222222222222 | 0 |
| 0.8729166666666667 | 0 |
| 0.873611111111111 | 0 |
| 0.8743055555555556 | 0 |
| 0.875 | 0 |
| 0.8756944444444444 | 0 |
| 0.876388888888889 | 0 |
| 0.8770833333333333 | 0 |
| 0.8777777777777778 | 0 |
| 0.8784722222222222 | 0 |
| 0.8791666666666668 | 0 |
| 0.8798611111111111 | 0 |
| 0.8805555555555555 | 0 |
| 0.88125 | 0 |
| 0.8819444444444445 | 0 |
| 0.8826388888888889 | 0 |
| 0.8833333333333333 | 0 |
| 0.8840277777777777 | 0 |
| 0.8847222222222223 | 0 |
| 0.8854166666666666 | 0 |
| 0.8861111111111111 | 0 |
| 0.8868055555555556 | 0 |
| 0.8875000000000001 | 0 |
| 0.8881944444444444 | 0 |
| 0.8888888888888888 | 0 |
| 0.8895833333333334 | 0 |
| 0.8902777777777778 | 0 |
| 0.8909722222222222 | 0 |
| 0.8916666666666666 | 0 |
| 0.8923611111111112 | 0 |
| 0.8930555555555556 | 0 |
| 0.8937499999999999 | 0 |
| 0.8944444444444444 | 0 |
| 0.8951388888888889 | 0 |
| 0.8958333333333334 | 0 |
| 0.8965277777777777 | 0 |
| 0.8972222222222223 | 0 |
| 0.8979166666666667 | 0 |
| 0.8986111111111111 | 0 |
| 0.8993055555555555 | 0 |
| 0.9 | 0 |
| 0.9006944444444445 | 0 |
| 0.9013888888888889 | 0 |
| 0.9020833333333332 | 0 |
| 0.9027777777777778 | 0 |
| 0.9034722222222222 | 0 |
| 0.9041666666666667 | 0 |
| 0.904861111111111 | 0 |
| 0.9055555555555556 | 0 |
| 0.90625 | 0 |
| 0.9069444444444444 | 0 |
| 0.907638888888889 | 0 |
| 0.9083333333333333 | 0 |
| 0.9090277777777778 | 0 |
| 0.9097222222222222 | 0 |
| 0.9104166666666668 | 0 |
| 0.9111111111111111 | 0 |
| 0.9118055555555555 | 0 |
| 0.9125 | 0 |
| 0.9131944444444445 | 0 |
| 0.9138888888888889 | 0 |
| 0.9145833333333333 | 0 |
| 0.9152777777777777 | 0 |
| 0.9159722222222223 | 0 |
| 0.9166666666666666 | 0 |
| 0.9173611111111111 | 0 |
| 0.9180555555555556 | 0 |
| 0.9187500000000001 | 0 |
| 0.9194444444444444 | 0 |
| 0.9201388888888888 | 0 |
| 0.9208333333333334 | 0 |
| 0.9215277777777778 | 0 |
| 0.9222222222222222 | 0 |
| 0.9229166666666666 | 0 |
| 0.9236111111111112 | 0 |
| 0.9243055555555556 | 0 |
| 0.9249999999999999 | 0 |
| 0.9256944444444444 | 0 |
| 0.9263888888888889 | 0 |
| 0.9270833333333334 | 0 |
| 0.9277777777777777 | 0 |
| 0.9284722222222223 | 0 |
| 0.9291666666666667 | 0 |
| 0.9298611111111111 | 0 |
| 0.9305555555555555 | 0 |
| 0.93125 | 0 |
| 0.9319444444444445 | 0 |
| 0.9326388888888889 | 0 |
| 0.9333333333333332 | 0 |
| 0.9340277777777778 | 0 |
| 0.9347222222222222 | 0 |
| 0.9354166666666667 | 0 |
| 0.936111111111111 | 0 |
| 0.9368055555555556 | 0 |
| 0.9375 | 0 |
| 0.9381944444444444 | 0 |
| 0.938888888888889 | 0 |
| 0.9395833333333333 | 0 |
| 0.9402777777777778 | 0 |
| 0.9409722222222222 | 0 |
| 0.9416666666666668 | 0 |
| 0.9423611111111111 | 0 |
| 0.9430555555555555 | 0 |
| 0.94375 | 0 |
| 0.9444444444444445 | 0 |
| 0.9451388888888889 | 0 |
| 0.9458333333333333 | 0 |
| 0.9465277777777777 | 0 |
| 0.9472222222222223 | 0 |
| 0.9479166666666666 | 0 |
| 0.9486111111111111 | 0 |
| 0.9493055555555556 | 0 |
| 0.9500000000000001 | 0 |
| 0.9506944444444444 | 0 |
| 0.9513888888888888 | 0 |
| 0.9520833333333334 | 0 |
| 0.9527777777777778 | 0 |
| 0.9534722222222222 | 0 |
| 0.9541666666666666 | 0 |
| 0.9548611111111112 | 0 |
| 0.9555555555555556 | 0 |
| 0.9562499999999999 | 0 |
| 0.9569444444444444 | 0 |
| 0.9576388888888889 | 0 |
| 0.9583333333333334 | 0 |
| 0.9590277777777777 | 0 |
| 0.9597222222222223 | 0 |
| 0.9604166666666667 | 0 |
| 0.9611111111111111 | 0 |
| 0.9618055555555555 | 0 |
| 0.9625 | 0 |
| 0.9631944444444445 | 0 |
| 0.9638888888888889 | 0 |
| 0.9645833333333332 | 0 |
| 0.9652777777777778 | 0 |
| 0.9659722222222222 | 0 |
| 0.9666666666666667 | 0 |
| 0.967361111111111 | 0 |
| 0.9680555555555556 | 0 |
| 0.96875 | 0 |
| 0.9694444444444444 | 0 |
| 0.970138888888889 | 0 |
| 0.9708333333333333 | 0 |
| 0.9715277777777778 | 0 |
| 0.9722222222222222 | 0 |
| 0.9729166666666668 | 0 |
| 0.9736111111111111 | 0 |
| 0.9743055555555555 | 0 |
| 0.975 | 0 |
| 0.9756944444444445 | 0 |
| 0.9763888888888889 | 0 |
| 0.9770833333333333 | 0 |
| 0.9777777777777777 | 0 |
| 0.9784722222222223 | 0 |
| 0.9791666666666666 | 0 |
| 0.9798611111111111 | 0 |
| 0.9805555555555556 | 0 |
| 0.9812500000000001 | 0 |
| 0.9819444444444444 | 0 |
| 0.9826388888888888 | 0 |
| 0.9833333333333334 | 0 |
| 0.9840277777777778 | 0 |
| 0.9847222222222222 | 0 |
| 0.9854166666666666 | 0 |
| 0.9861111111111112 | 0 |
| 0.9868055555555556 | 0 |
| 0.9874999999999999 | 0 |
| 0.9881944444444444 | 0 |
| 0.9888888888888889 | 0 |
| 0.9895833333333334 | 0 |
| 0.9902777777777777 | 0 |
| 0.9909722222222223 | 0 |
| 0.9916666666666667 | 0 |
| 0.9923611111111111 | 0 |
| 0.9930555555555555 | 0 |
| 0.99375 | 0 |
| 0.9944444444444445 | 0 |
| 0.9951388888888889 | 0 |
| 0.9958333333333332 | 0 |
| 0.9965277777777778 | 0 |
| 0.9972222222222222 | 0 |
| 0.9979166666666667 | 0 |
| 0.998611111111111 | 0 |
| 0.9993055555555556 | 0 |